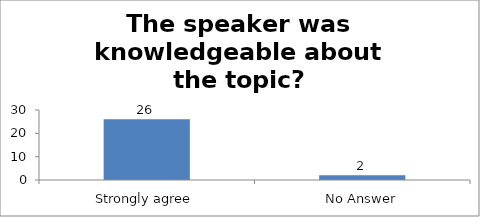
| Category | The speaker was knowledgeable about the topic? |
|---|---|
| Strongly agree | 26 |
| No Answer | 2 |